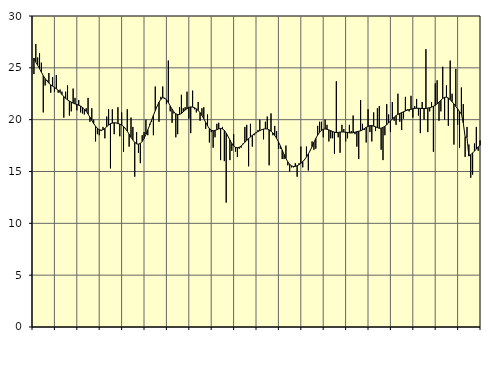
| Category | Piggar | Series 1 |
|---|---|---|
| nan | 24.4 | 25.94 |
| 1.0 | 27.3 | 25.55 |
| 1.0 | 26 | 25.25 |
| 1.0 | 26.4 | 24.92 |
| 1.0 | 25.5 | 24.58 |
| 1.0 | 20.7 | 24.24 |
| 1.0 | 23.3 | 23.96 |
| 1.0 | 23.8 | 23.73 |
| 1.0 | 24.5 | 23.52 |
| 1.0 | 22.6 | 23.36 |
| 1.0 | 24.1 | 23.24 |
| 1.0 | 22.7 | 23.11 |
| nan | 24.3 | 22.98 |
| 2.0 | 22.6 | 22.83 |
| 2.0 | 22.9 | 22.64 |
| 2.0 | 22.7 | 22.43 |
| 2.0 | 20.2 | 22.23 |
| 2.0 | 22.7 | 22.05 |
| 2.0 | 23.3 | 21.91 |
| 2.0 | 20.4 | 21.79 |
| 2.0 | 20.8 | 21.69 |
| 2.0 | 23 | 21.6 |
| 2.0 | 22.1 | 21.52 |
| 2.0 | 20.9 | 21.46 |
| nan | 21.9 | 21.39 |
| 3.0 | 20.7 | 21.31 |
| 3.0 | 20.6 | 21.18 |
| 3.0 | 20.5 | 21.02 |
| 3.0 | 21.1 | 20.81 |
| 3.0 | 22.1 | 20.55 |
| 3.0 | 19.8 | 20.24 |
| 3.0 | 21.1 | 19.93 |
| 3.0 | 20 | 19.63 |
| 3.0 | 17.9 | 19.37 |
| 3.0 | 18.6 | 19.16 |
| 3.0 | 18.5 | 19.03 |
| nan | 18.9 | 18.98 |
| 4.0 | 19.3 | 19.03 |
| 4.0 | 18.2 | 19.15 |
| 4.0 | 20.3 | 19.32 |
| 4.0 | 21 | 19.48 |
| 4.0 | 15.3 | 19.61 |
| 4.0 | 21 | 19.67 |
| 4.0 | 18.6 | 19.7 |
| 4.0 | 19.7 | 19.68 |
| 4.0 | 21.2 | 19.63 |
| 4.0 | 18.4 | 19.57 |
| 4.0 | 20.7 | 19.48 |
| nan | 16.9 | 19.34 |
| 5.0 | 19.2 | 19.14 |
| 5.0 | 21 | 18.89 |
| 5.0 | 17.4 | 18.6 |
| 5.0 | 20.2 | 18.3 |
| 5.0 | 19.3 | 18.03 |
| 5.0 | 14.5 | 17.81 |
| 5.0 | 18.8 | 17.67 |
| 5.0 | 16.8 | 17.64 |
| 5.0 | 15.8 | 17.71 |
| 5.0 | 18.5 | 17.9 |
| 5.0 | 18.8 | 18.19 |
| nan | 20 | 18.58 |
| 6.0 | 18.5 | 19.02 |
| 6.0 | 19.6 | 19.47 |
| 6.0 | 19.8 | 19.94 |
| 6.0 | 18.5 | 20.41 |
| 6.0 | 23.2 | 20.87 |
| 6.0 | 21.3 | 21.31 |
| 6.0 | 19.8 | 21.69 |
| 6.0 | 22.2 | 21.97 |
| 6.0 | 23.2 | 22.11 |
| 6.0 | 22 | 22.09 |
| 6.0 | 21.5 | 21.93 |
| nan | 25.7 | 21.65 |
| 7.0 | 20.8 | 21.33 |
| 7.0 | 19.7 | 21.02 |
| 7.0 | 20.6 | 20.75 |
| 7.0 | 18.3 | 20.57 |
| 7.0 | 18.6 | 20.49 |
| 7.0 | 21.2 | 20.5 |
| 7.0 | 22.4 | 20.6 |
| 7.0 | 21.1 | 20.75 |
| 7.0 | 21.2 | 20.93 |
| 7.0 | 22.7 | 21.07 |
| 7.0 | 20.1 | 21.18 |
| nan | 18.7 | 21.23 |
| 8.0 | 22.8 | 21.21 |
| 8.0 | 21 | 21.15 |
| 8.0 | 20.7 | 21.04 |
| 8.0 | 21.7 | 20.89 |
| 8.0 | 19.9 | 20.68 |
| 8.0 | 21.1 | 20.41 |
| 8.0 | 21.2 | 20.09 |
| 8.0 | 19.1 | 19.74 |
| 8.0 | 20.5 | 19.41 |
| 8.0 | 17.8 | 19.14 |
| 8.0 | 18.8 | 18.98 |
| nan | 17.3 | 18.93 |
| 9.0 | 18.3 | 18.96 |
| 9.0 | 19.6 | 19.03 |
| 9.0 | 19.7 | 19.11 |
| 9.0 | 16.1 | 19.15 |
| 9.0 | 19.3 | 19.11 |
| 9.0 | 16 | 18.97 |
| 9.0 | 12 | 18.71 |
| 9.0 | 18.4 | 18.38 |
| 9.0 | 16.1 | 18.03 |
| 9.0 | 17 | 17.7 |
| 9.0 | 18.6 | 17.46 |
| nan | 16.9 | 17.32 |
| 10.0 | 16.4 | 17.29 |
| 10.0 | 17.2 | 17.34 |
| 10.0 | 17.3 | 17.46 |
| 10.0 | 17.7 | 17.63 |
| 10.0 | 19.3 | 17.82 |
| 10.0 | 19.5 | 18 |
| 10.0 | 15.5 | 18.17 |
| 10.0 | 19.6 | 18.33 |
| 10.0 | 17.4 | 18.49 |
| 10.0 | 18.5 | 18.63 |
| 10.0 | 18.7 | 18.75 |
| nan | 19 | 18.85 |
| 11.0 | 20 | 18.94 |
| 11.0 | 19 | 19.03 |
| 11.0 | 18.1 | 19.09 |
| 11.0 | 19.8 | 19.12 |
| 11.0 | 20.3 | 19.1 |
| 11.0 | 15.6 | 19.02 |
| 11.0 | 20.6 | 18.89 |
| 11.0 | 18.5 | 18.72 |
| 11.0 | 19.4 | 18.48 |
| 11.0 | 18.9 | 18.2 |
| 11.0 | 17.2 | 17.86 |
| nan | 17.2 | 17.48 |
| 12.0 | 16.2 | 17.06 |
| 12.0 | 16.2 | 16.65 |
| 12.0 | 17.5 | 16.26 |
| 12.0 | 15.6 | 15.93 |
| 12.0 | 15 | 15.69 |
| 12.0 | 15.4 | 15.54 |
| 12.0 | 15.4 | 15.48 |
| 12.0 | 15.8 | 15.49 |
| 12.0 | 14.5 | 15.56 |
| 12.0 | 15.8 | 15.66 |
| 12.0 | 17.4 | 15.79 |
| nan | 15.4 | 15.96 |
| 13.0 | 16.1 | 16.16 |
| 13.0 | 17.4 | 16.4 |
| 13.0 | 15.1 | 16.69 |
| 13.0 | 17 | 17.02 |
| 13.0 | 17.9 | 17.4 |
| 13.0 | 17.1 | 17.81 |
| 13.0 | 17.2 | 18.19 |
| 13.0 | 19.4 | 18.52 |
| 13.0 | 19.8 | 18.78 |
| 13.0 | 19.8 | 18.97 |
| 13.0 | 18.3 | 19.07 |
| nan | 20 | 19.1 |
| 14.0 | 19.5 | 19.08 |
| 14.0 | 17.9 | 19.01 |
| 14.0 | 18.2 | 18.94 |
| 14.0 | 18.2 | 18.86 |
| 14.0 | 16.7 | 18.79 |
| 14.0 | 23.7 | 18.76 |
| 14.0 | 18.3 | 18.77 |
| 14.0 | 16.8 | 18.8 |
| 14.0 | 19.5 | 18.82 |
| 14.0 | 19.1 | 18.81 |
| 14.0 | 17.9 | 18.79 |
| nan | 18.2 | 18.76 |
| 15.0 | 19.5 | 18.73 |
| 15.0 | 18.9 | 18.72 |
| 15.0 | 20.4 | 18.74 |
| 15.0 | 18.6 | 18.79 |
| 15.0 | 17.4 | 18.84 |
| 15.0 | 16.2 | 18.89 |
| 15.0 | 21.9 | 18.93 |
| 15.0 | 19.6 | 19.01 |
| 15.0 | 19 | 19.14 |
| 15.0 | 17.8 | 19.26 |
| 15.0 | 21 | 19.36 |
| nan | 18.8 | 19.42 |
| 16.0 | 17.9 | 19.43 |
| 16.0 | 20.7 | 19.38 |
| 16.0 | 18.9 | 19.31 |
| 16.0 | 21.1 | 19.23 |
| 16.0 | 21.3 | 19.17 |
| 16.0 | 17.1 | 19.18 |
| 16.0 | 16.1 | 19.25 |
| 16.0 | 18.5 | 19.36 |
| 16.0 | 21.5 | 19.51 |
| 16.0 | 20.5 | 19.68 |
| 16.0 | 18.8 | 19.87 |
| nan | 21.7 | 20.06 |
| 17.0 | 19.9 | 20.24 |
| 17.0 | 19.5 | 20.39 |
| 17.0 | 22.5 | 20.5 |
| 17.0 | 19.8 | 20.6 |
| 17.0 | 19 | 20.68 |
| 17.0 | 20.1 | 20.76 |
| 17.0 | 22.2 | 20.84 |
| 17.0 | 21 | 20.92 |
| 17.0 | 20.8 | 20.97 |
| 17.0 | 22.3 | 21.01 |
| 17.0 | 20.2 | 21.05 |
| nan | 21.3 | 21.09 |
| 18.0 | 22 | 21.1 |
| 18.0 | 20.4 | 21.1 |
| 18.0 | 18.7 | 21.09 |
| 18.0 | 21.7 | 21.07 |
| 18.0 | 20 | 21.07 |
| 18.0 | 26.8 | 21.08 |
| 18.0 | 18.8 | 21.12 |
| 18.0 | 20.8 | 21.16 |
| 18.0 | 21.7 | 21.21 |
| 18.0 | 16.9 | 21.29 |
| 18.0 | 23.5 | 21.39 |
| nan | 23.8 | 21.53 |
| 19.0 | 19.9 | 21.7 |
| 19.0 | 20.8 | 21.88 |
| 19.0 | 25.1 | 22.04 |
| 19.0 | 20 | 22.15 |
| 19.0 | 23.3 | 22.17 |
| 19.0 | 19.4 | 22.09 |
| 19.0 | 25.7 | 21.92 |
| 19.0 | 22.5 | 21.73 |
| 19.0 | 17.6 | 21.51 |
| 19.0 | 24.9 | 21.28 |
| 19.0 | 19.5 | 21.03 |
| nan | 17.3 | 20.78 |
| 20.0 | 23.1 | 20.55 |
| 20.0 | 21.5 | 19.7 |
| 20.0 | 16.4 | 18.32 |
| 20.0 | 19.3 | 18.3 |
| 20.0 | 17.6 | 16.49 |
| 20.0 | 14.4 | 16.62 |
| 20.0 | 14.7 | 16.79 |
| 20.0 | 17.7 | 16.97 |
| 20.0 | 19.3 | 17.17 |
| 20.0 | 17 | 17.37 |
| 20.0 | 18 | 17.54 |